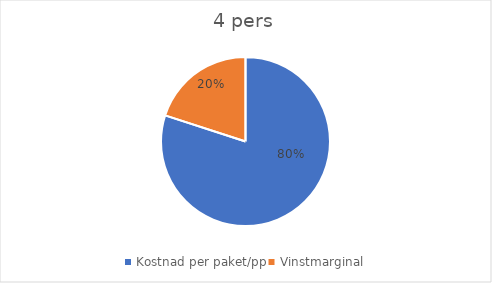
| Category | Series 0 |
|---|---|
| Kostnad per paket/pp | 10000 |
| Vinstmarginal | 2500 |